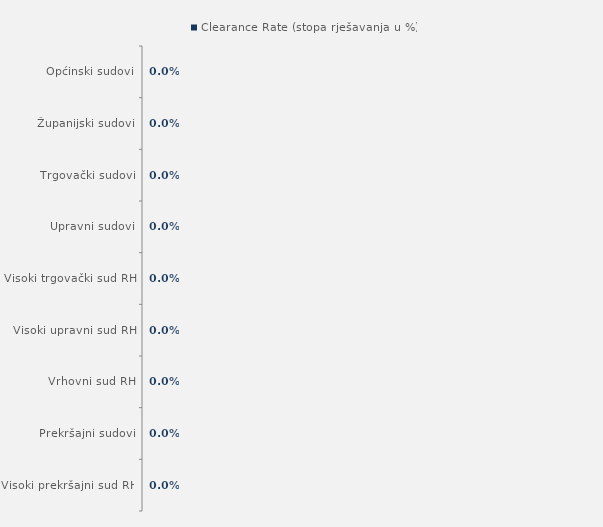
| Category | Clearance Rate (stopa rješavanja u %) |
|---|---|
| Općinski sudovi | 1.062 |
| Županijski sudovi | 1.008 |
| Trgovački sudovi | 1.036 |
| Upravni sudovi | 1.127 |
| Visoki trgovački sud RH | 1.909 |
| Visoki upravni sud RH | 0.959 |
| Vrhovni sud RH | 1.315 |
| Prekršajni sudovi | 1.141 |
| Visoki prekršajni sud RH | 2.097 |